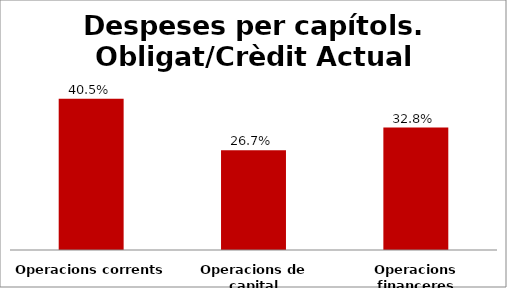
| Category | Series 0 |
|---|---|
| Operacions corrents | 0.405 |
| Operacions de capital | 0.267 |
| Operacions financeres | 0.328 |